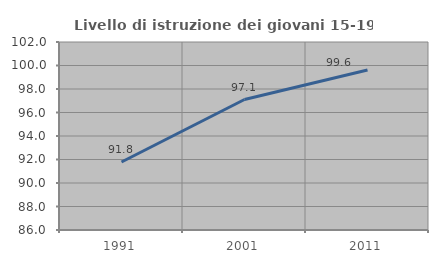
| Category | Livello di istruzione dei giovani 15-19 anni |
|---|---|
| 1991.0 | 91.784 |
| 2001.0 | 97.103 |
| 2011.0 | 99.622 |